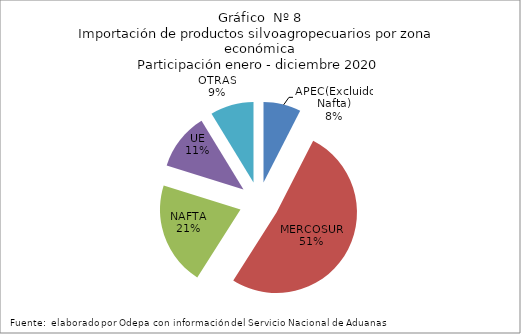
| Category | Series 0 |
|---|---|
| APEC(Excluido Nafta) | 500112.371 |
| MERCOSUR | 3420873.062 |
| NAFTA | 1382406.788 |
| UE | 759355.815 |
| OTRAS | 579988.965 |